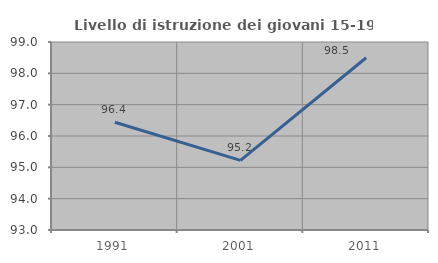
| Category | Livello di istruzione dei giovani 15-19 anni |
|---|---|
| 1991.0 | 96.438 |
| 2001.0 | 95.221 |
| 2011.0 | 98.496 |